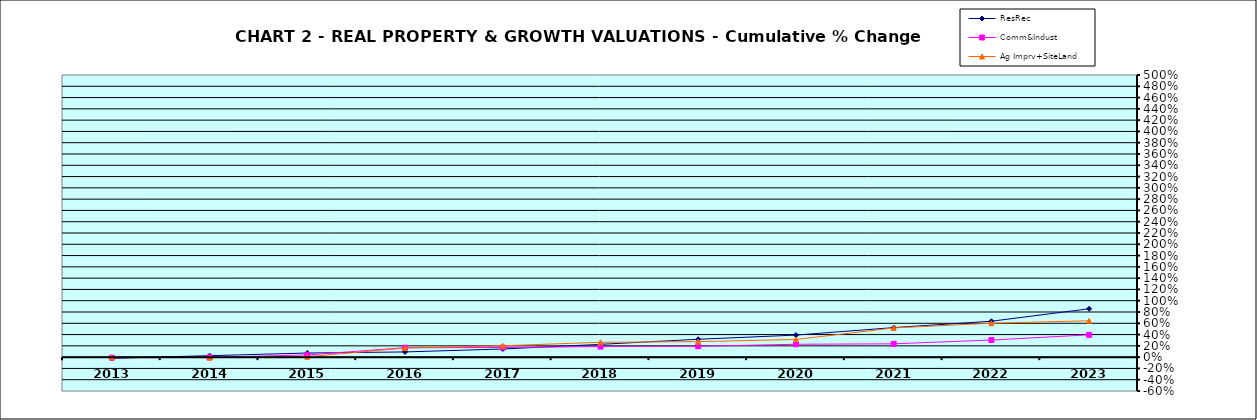
| Category | ResRec | Comm&Indust | Ag Imprv+SiteLand |
|---|---|---|---|
| 2013.0 | -0.02 | -0.009 | 0 |
| 2014.0 | 0.026 | -0.004 | -0.008 |
| 2015.0 | 0.073 | 0.039 | 0.008 |
| 2016.0 | 0.092 | 0.167 | 0.162 |
| 2017.0 | 0.144 | 0.171 | 0.202 |
| 2018.0 | 0.227 | 0.187 | 0.263 |
| 2019.0 | 0.317 | 0.193 | 0.274 |
| 2020.0 | 0.391 | 0.228 | 0.313 |
| 2021.0 | 0.523 | 0.236 | 0.517 |
| 2022.0 | 0.636 | 0.303 | 0.601 |
| 2023.0 | 0.857 | 0.396 | 0.644 |